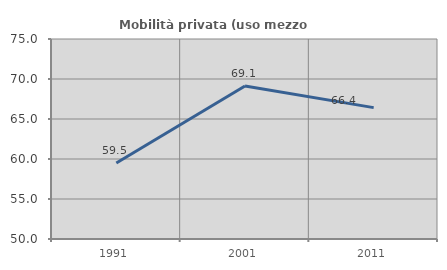
| Category | Mobilità privata (uso mezzo privato) |
|---|---|
| 1991.0 | 59.494 |
| 2001.0 | 69.118 |
| 2011.0 | 66.423 |